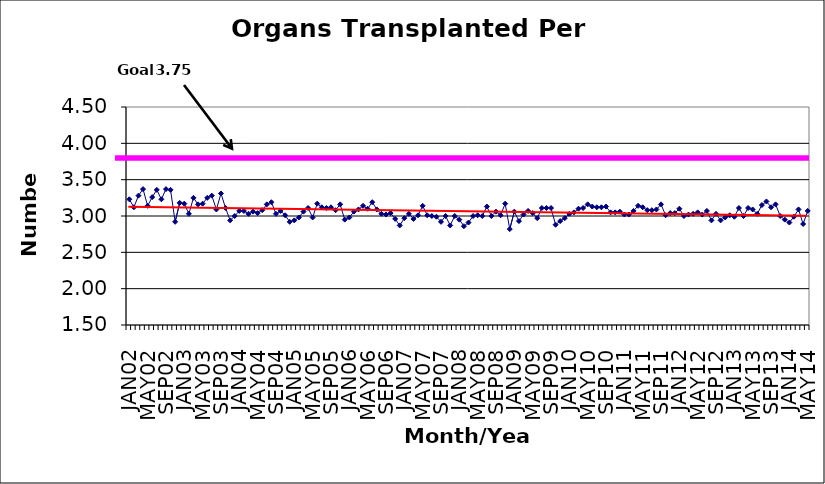
| Category | Series 0 |
|---|---|
| JAN02 | 3.23 |
| FEB02 | 3.12 |
| MAR02 | 3.28 |
| APR02 | 3.37 |
| MAY02 | 3.14 |
| JUN02 | 3.26 |
| JUL02 | 3.36 |
| AUG02 | 3.23 |
| SEP02 | 3.37 |
| OCT02 | 3.36 |
| NOV02 | 2.92 |
| DEC02 | 3.18 |
| JAN03 | 3.17 |
| FEB03 | 3.03 |
| MAR03 | 3.25 |
| APR03 | 3.16 |
| MAY03 | 3.17 |
| JUN03 | 3.25 |
| JUL03 | 3.28 |
| AUG03 | 3.09 |
| SEP03 | 3.31 |
| OCT03 | 3.11 |
| NOV03 | 2.94 |
| DEC03 | 3 |
| JAN04 | 3.07 |
| FEB04 | 3.07 |
| MAR04 | 3.03 |
| APR04 | 3.06 |
| MAY04 | 3.04 |
| JUN04 | 3.08 |
| JUL04 | 3.16 |
| AUG04 | 3.19 |
| SEP04 | 3.03 |
| OCT04 | 3.07 |
| NOV04 | 3.01 |
| DEC04 | 2.92 |
| JAN05 | 2.94 |
| FEB05 | 2.98 |
| MAR05 | 3.06 |
| APR05 | 3.11 |
| MAY05 | 2.98 |
| JUN05 | 3.17 |
| JUL05 | 3.12 |
| AUG05 | 3.11 |
| SEP05 | 3.12 |
| OCT05 | 3.08 |
| NOV05 | 3.16 |
| DEC05 | 2.95 |
| JAN06 | 2.98 |
| FEB06 | 3.06 |
| MAR06 | 3.09 |
| APR06 | 3.14 |
| MAY06 | 3.1 |
| JUN06 | 3.19 |
| JUL06 | 3.09 |
| AUG06 | 3.03 |
| SEP06 | 3.02 |
| OCT06 | 3.04 |
| NOV06 | 2.96 |
| DEC06 | 2.87 |
| JAN07 | 2.97 |
| FEB07 | 3.03 |
| MAR07 | 2.96 |
| APR07 | 3.01 |
| MAY07 | 3.14 |
| JUN07 | 3.01 |
| JUL07 | 3 |
| AUG07 | 2.99 |
| SEP07 | 2.92 |
| OCT07 | 3 |
| NOV07 | 2.87 |
| DEC07 | 3 |
| JAN08 | 2.95 |
| FEB08 | 2.86 |
| MAR08 | 2.91 |
| APR08 | 3 |
| MAY08 | 3.01 |
| JUN08 | 3 |
| JUL08 | 3.13 |
| AUG08 | 3 |
| SEP08 | 3.06 |
| OCT08 | 3.01 |
| NOV08 | 3.17 |
| DEC08 | 2.82 |
| JAN09 | 3.06 |
| FEB09 | 2.93 |
| MAR09 | 3.02 |
| APR09 | 3.07 |
| MAY09 | 3.04 |
| JUN09 | 2.97 |
| JUL09 | 3.11 |
| AUG09 | 3.11 |
| SEP09 | 3.11 |
| OCT09 | 2.88 |
| NOV09 | 2.93 |
| DEC09 | 2.97 |
| JAN10 | 3.03 |
| FEB10 | 3.05 |
| MAR10 | 3.1 |
| APR10 | 3.11 |
| MAY10 | 3.16 |
| JUN10 | 3.13 |
| JUL10 | 3.12 |
| AUG10 | 3.12 |
| SEP10 | 3.13 |
| OCT10 | 3.05 |
| NOV10 | 3.05 |
| DEC10 | 3.06 |
| JAN11 | 3.02 |
| FEB11 | 3.02 |
| MAR11 | 3.07 |
| APR11 | 3.14 |
| MAY11 | 3.12 |
| JUN11 | 3.08 |
| JUL11 | 3.08 |
| AUG11 | 3.09 |
| SEP11 | 3.16 |
| OCT11 | 3.01 |
| NOV11 | 3.04 |
| DEC11 | 3.04 |
| JAN12 | 3.1 |
| FEB12 | 3 |
| MAR12 | 3.02 |
| APR12 | 3.03 |
| MAY12 | 3.05 |
| JUN12 | 3.02 |
| JUL12 | 3.07 |
| AUG12 | 2.94 |
| SEP12 | 3.03 |
| OCT12 | 2.94 |
| NOV12 | 2.98 |
| DEC12 | 3.01 |
| JAN13 | 2.99 |
| FEB13 | 3.11 |
| MAR13 | 3 |
| APR13 | 3.11 |
| MAY13 | 3.09 |
| JUN13 | 3.03 |
| JUL13 | 3.15 |
| AUG13 | 3.2 |
| SEP13 | 3.12 |
| OCT13 | 3.16 |
| NOV13 | 3 |
| DEC13 | 2.95 |
| JAN14 | 2.91 |
| FEB14 | 2.99 |
| MAR14 | 3.09 |
| APR14 | 2.89 |
| MAY14 | 3.07 |